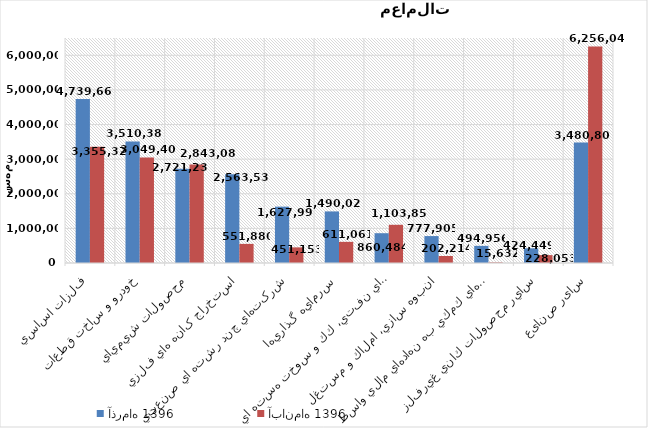
| Category | آذر‌ماه 1396 | آبان‌ماه 1396 |
|---|---|---|
| فلزات اساسي | 4739665.623 | 3355328.206 |
| خودرو و ساخت قطعات | 3510383.074 | 3049399.812 |
| محصولات شيميايي | 2721239.257 | 2843084.657 |
| استخراج کانه هاي فلزي | 2563533.425 | 551879.619 |
| شرکتهاي چند رشته اي صنعتي | 1627995.158 | 451153.205 |
| سرمايه گذاريها | 1490020.237 | 611060.76 |
| فراورده هاي نفتي، كك و سوخت هسته اي | 860484.138 | 1103852.087 |
| انبوه سازي، املاك و مستغلات | 777904.595 | 202214.377 |
| فعاليتهاي كمكي به نهادهاي مالي واسط | 494956.458 | 15632.343 |
| ساير محصولات كاني غيرفلزي | 424449.215 | 228053.279 |
| سایر صنایع | 3480809.005 | 6256046.922 |